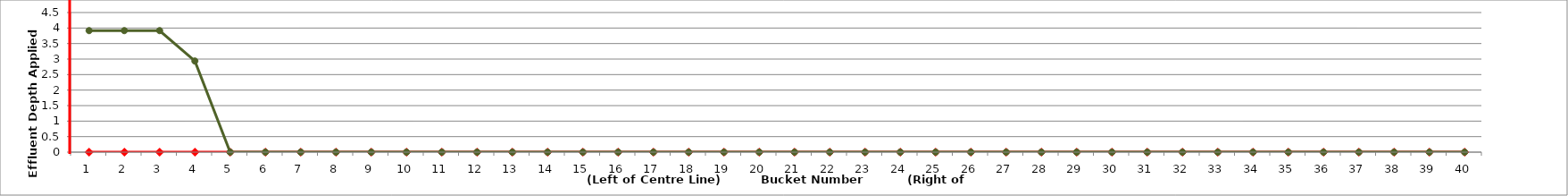
| Category | Maximum Allowable | Actual Applied Depth |
|---|---|---|
| 1.0 | 0 | 3.916 |
| 2.0 | 0 | 3.916 |
| 3.0 | 0 | 3.916 |
| 4.0 | 0 | 2.937 |
| 5.0 | 0 | 0 |
| 6.0 | 0 | 0 |
| 7.0 | 0 | 0 |
| 8.0 | 0 | 0 |
| 9.0 | 0 | 0 |
| 10.0 | 0 | 0 |
| 11.0 | 0 | 0 |
| 12.0 | 0 | 0 |
| 13.0 | 0 | 0 |
| 14.0 | 0 | 0 |
| 15.0 | 0 | 0 |
| 16.0 | 0 | 0 |
| 17.0 | 0 | 0 |
| 18.0 | 0 | 0 |
| 19.0 | 0 | 0 |
| 20.0 | 0 | 0 |
| 21.0 | 0 | 0 |
| 22.0 | 0 | 0 |
| 23.0 | 0 | 0 |
| 24.0 | 0 | 0 |
| 25.0 | 0 | 0 |
| 26.0 | 0 | 0 |
| 27.0 | 0 | 0 |
| 28.0 | 0 | 0 |
| 29.0 | 0 | 0 |
| 30.0 | 0 | 0 |
| 31.0 | 0 | 0 |
| 32.0 | 0 | 0 |
| 33.0 | 0 | 0 |
| 34.0 | 0 | 0 |
| 35.0 | 0 | 0 |
| 36.0 | 0 | 0 |
| 37.0 | 0 | 0 |
| 38.0 | 0 | 0 |
| 39.0 | 0 | 0 |
| 40.0 | 0 | 0 |